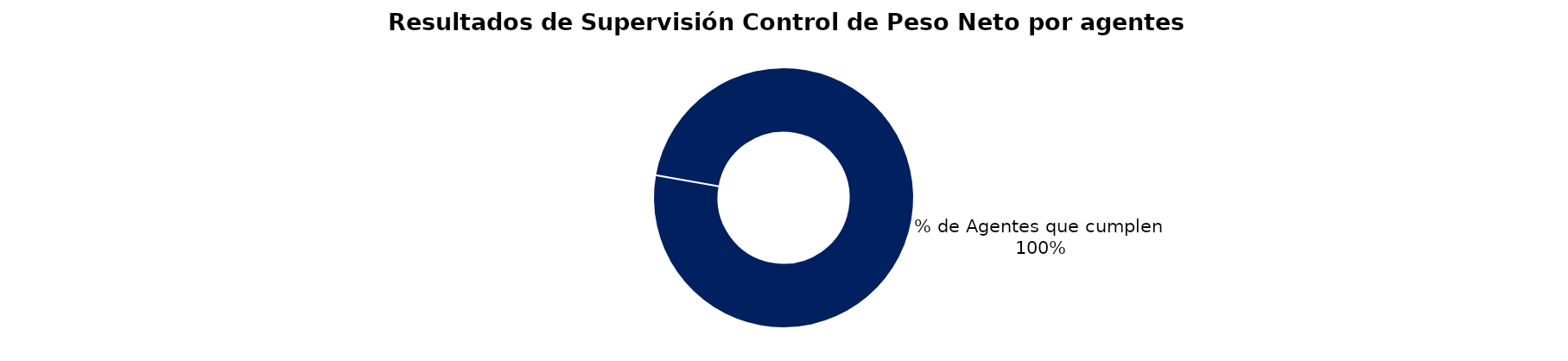
| Category | Series 0 |
|---|---|
| % de Agentes que no cumplen | 0 |
| % de Agentes que cumplen | 24 |